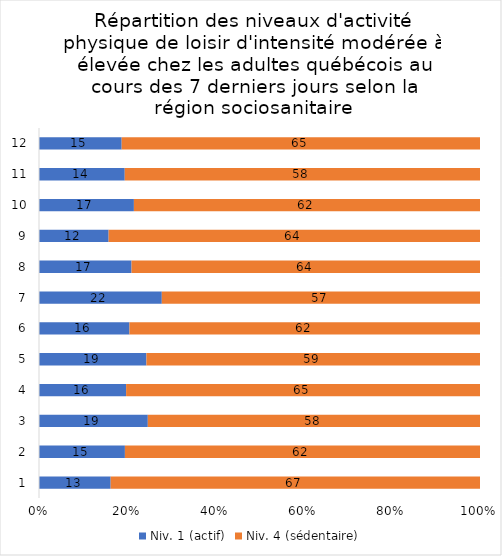
| Category | Niv. 1 (actif) | Niv. 4 (sédentaire) |
|---|---|---|
| 0 | 13 | 67 |
| 1 | 15 | 62 |
| 2 | 19 | 58 |
| 3 | 16 | 65 |
| 4 | 19 | 59 |
| 5 | 16 | 62 |
| 6 | 22 | 57 |
| 7 | 17 | 64 |
| 8 | 12 | 64 |
| 9 | 17 | 62 |
| 10 | 14 | 58 |
| 11 | 15 | 65 |